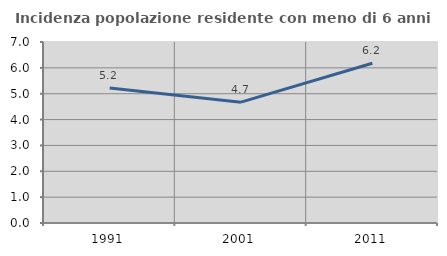
| Category | Incidenza popolazione residente con meno di 6 anni |
|---|---|
| 1991.0 | 5.219 |
| 2001.0 | 4.672 |
| 2011.0 | 6.178 |